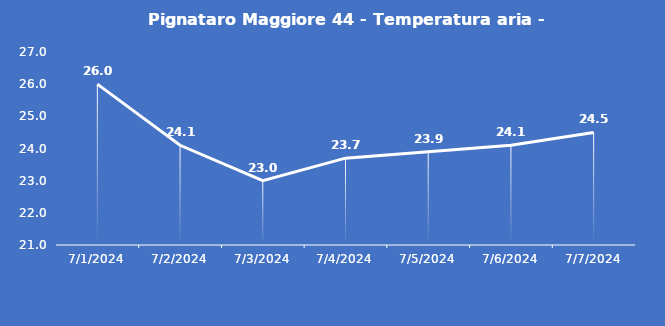
| Category | Pignataro Maggiore 44 - Temperatura aria - Grezzo (°C) |
|---|---|
| 7/1/24 | 26 |
| 7/2/24 | 24.1 |
| 7/3/24 | 23 |
| 7/4/24 | 23.7 |
| 7/5/24 | 23.9 |
| 7/6/24 | 24.1 |
| 7/7/24 | 24.5 |